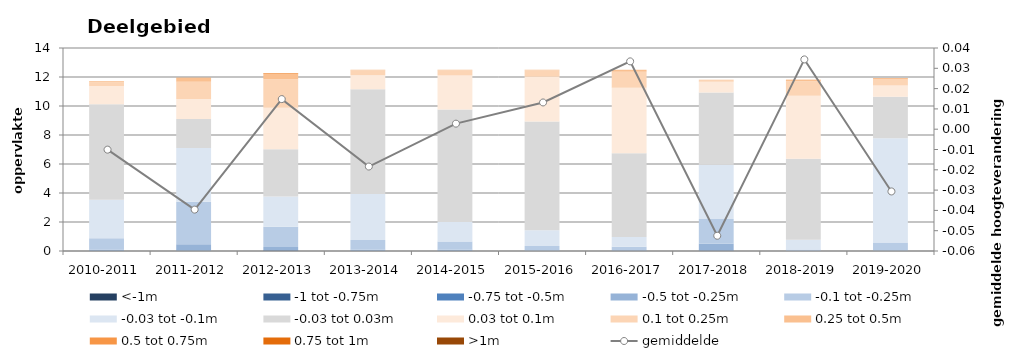
| Category | <-1m | -1 tot -0.75m | -0.75 tot -0.5m | -0.5 tot -0.25m | -0.1 tot -0.25m | -0.03 tot -0.1m | -0.03 tot 0.03m | 0.03 tot 0.1m | 0.1 tot 0.25m | 0.25 tot 0.5m | 0.5 tot 0.75m | 0.75 tot 1m | >1m |
|---|---|---|---|---|---|---|---|---|---|---|---|---|---|
| 2010-2011 | 0 | 0 | 0.006 | 0.104 | 0.775 | 2.645 | 6.585 | 1.259 | 0.26 | 0.061 | 0.011 | 0.003 | 0.001 |
| 2011-2012 | 0 | 0.001 | 0.018 | 0.44 | 2.946 | 3.703 | 1.999 | 1.372 | 1.189 | 0.27 | 0.014 | 0.002 | 0 |
| 2012-2013 | 0.009 | 0.008 | 0.029 | 0.236 | 1.386 | 2.095 | 3.259 | 2.856 | 1.972 | 0.38 | 0.034 | 0.006 | 0.002 |
| 2013-2014 | 0 | 0 | 0.004 | 0.087 | 0.664 | 3.168 | 7.233 | 0.972 | 0.337 | 0.034 | 0.002 | 0.001 | 0 |
| 2014-2015 | 0 | 0.001 | 0.003 | 0.074 | 0.573 | 1.351 | 7.757 | 2.342 | 0.364 | 0.033 | 0.004 | 0 | 0 |
| 2015-2016 | 0.001 | 0 | 0.001 | 0.027 | 0.309 | 1.096 | 7.504 | 3.081 | 0.447 | 0.035 | 0.001 | 0 | 0 |
| 2016-2017 | 0 | 0 | 0.008 | 0.048 | 0.232 | 0.686 | 5.777 | 4.51 | 1.1 | 0.14 | 0.002 | 0.001 | 0 |
| 2017-2018 | 0 | 0.001 | 0.028 | 0.474 | 1.697 | 3.755 | 4.969 | 0.744 | 0.119 | 0.017 | 0 | 0 | 0 |
| 2018-2019 | 0 | 0 | 0 | 0.006 | 0.098 | 0.671 | 5.594 | 4.335 | 1 | 0.095 | 0.003 | 0.001 | 0 |
| 2019-2020 | 0 | 0 | 0.001 | 0.031 | 0.55 | 7.199 | 2.851 | 0.787 | 0.436 | 0.064 | 0.004 | 0.001 | 0 |